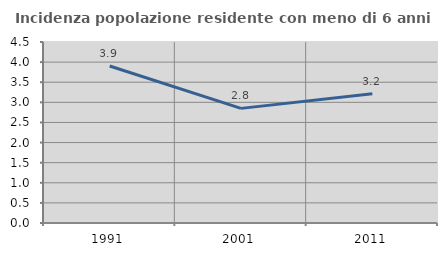
| Category | Incidenza popolazione residente con meno di 6 anni |
|---|---|
| 1991.0 | 3.905 |
| 2001.0 | 2.85 |
| 2011.0 | 3.215 |